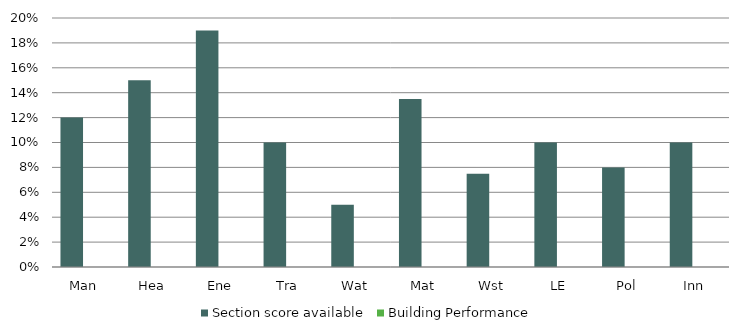
| Category | Section score available | Building Performance |
|---|---|---|
| Man | 0.12 | 0 |
| Hea | 0.15 | 0 |
| Ene | 0.19 | 0 |
| Tra | 0.1 | 0 |
| Wat | 0.05 | 0 |
| Mat | 0.135 | 0 |
| Wst | 0.075 | 0 |
| LE | 0.1 | 0 |
| Pol | 0.08 | 0 |
| Inn | 0.1 | 0 |